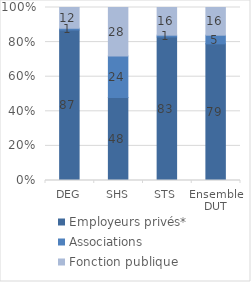
| Category | Employeurs privés* | Associations | Fonction publique |
|---|---|---|---|
| DEG | 87 | 1 | 12 |
| SHS | 48 | 24 | 28 |
| STS | 83 | 1 | 16 |
| Ensemble DUT | 79 | 5 | 16 |